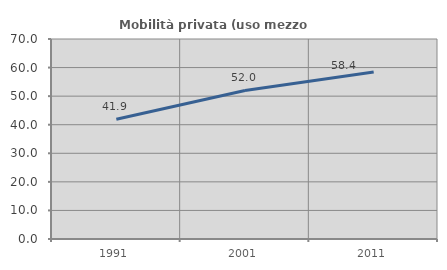
| Category | Mobilità privata (uso mezzo privato) |
|---|---|
| 1991.0 | 41.896 |
| 2001.0 | 51.989 |
| 2011.0 | 58.436 |